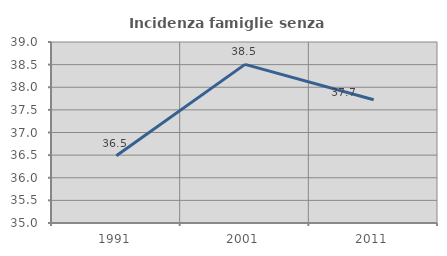
| Category | Incidenza famiglie senza nuclei |
|---|---|
| 1991.0 | 36.486 |
| 2001.0 | 38.506 |
| 2011.0 | 37.725 |